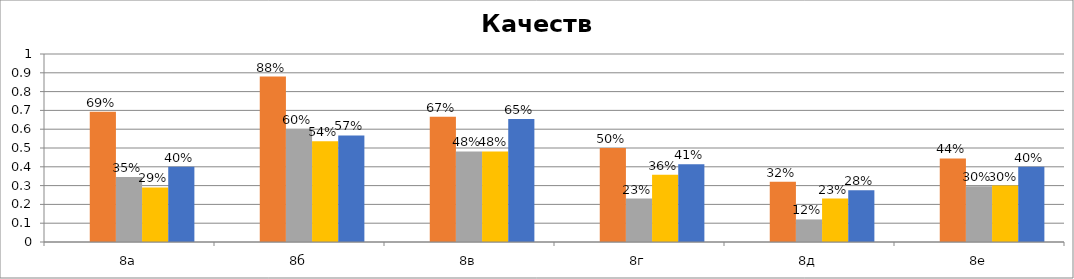
| Category | Series 0 | Series 1 | Series 2 | Series 3 | Series 4 |
|---|---|---|---|---|---|
| 8а |  | 0.692 | 0.346 | 0.29 | 0.4 |
| 8б |  | 0.88 | 0.6 | 0.536 | 0.567 |
| 8в |  | 0.667 | 0.481 | 0.481 | 0.654 |
| 8г |  | 0.5 | 0.231 | 0.357 | 0.414 |
| 8д |  | 0.32 | 0.12 | 0.231 | 0.276 |
| 8е |  | 0.444 | 0.296 | 0.3 | 0.4 |